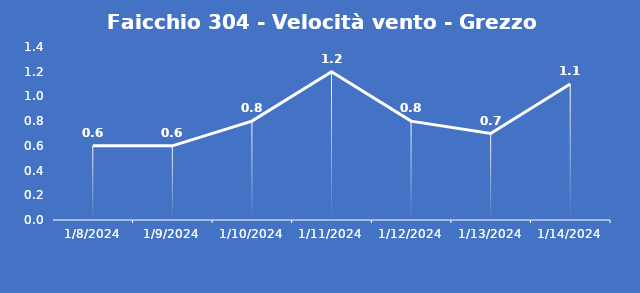
| Category | Faicchio 304 - Velocità vento - Grezzo (m/s) |
|---|---|
| 1/8/24 | 0.6 |
| 1/9/24 | 0.6 |
| 1/10/24 | 0.8 |
| 1/11/24 | 1.2 |
| 1/12/24 | 0.8 |
| 1/13/24 | 0.7 |
| 1/14/24 | 1.1 |